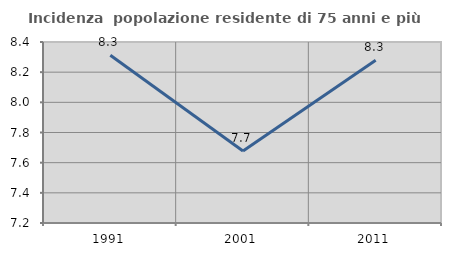
| Category | Incidenza  popolazione residente di 75 anni e più |
|---|---|
| 1991.0 | 8.313 |
| 2001.0 | 7.678 |
| 2011.0 | 8.278 |